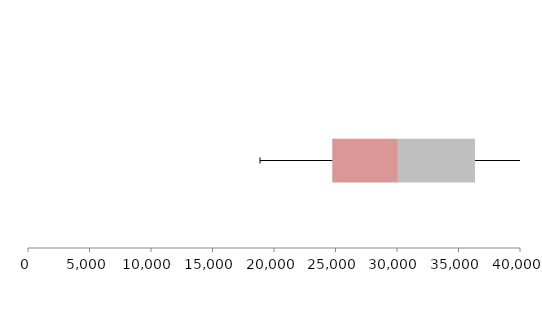
| Category | Series 1 | Series 2 | Series 3 |
|---|---|---|---|
| 0 | 24736.365 | 5334.028 | 6269.845 |